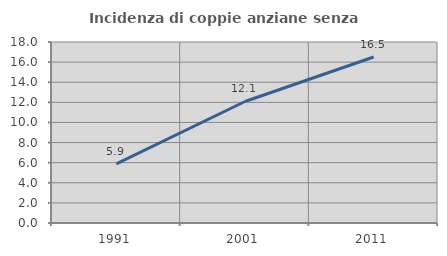
| Category | Incidenza di coppie anziane senza figli  |
|---|---|
| 1991.0 | 5.882 |
| 2001.0 | 12.085 |
| 2011.0 | 16.505 |